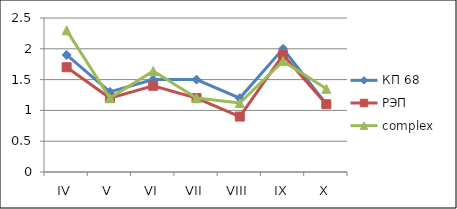
| Category | КП 68 | РЭП  | complex |
|---|---|---|---|
| IV | 1.9 | 1.7 | 2.3 |
| V | 1.3 | 1.2 | 1.2 |
| VI | 1.5 | 1.4 | 1.64 |
| VII | 1.5 | 1.2 | 1.2 |
| VIII | 1.2 | 0.9 | 1.12 |
| IX | 2 | 1.9 | 1.8 |
| X | 1.1 | 1.1 | 1.35 |